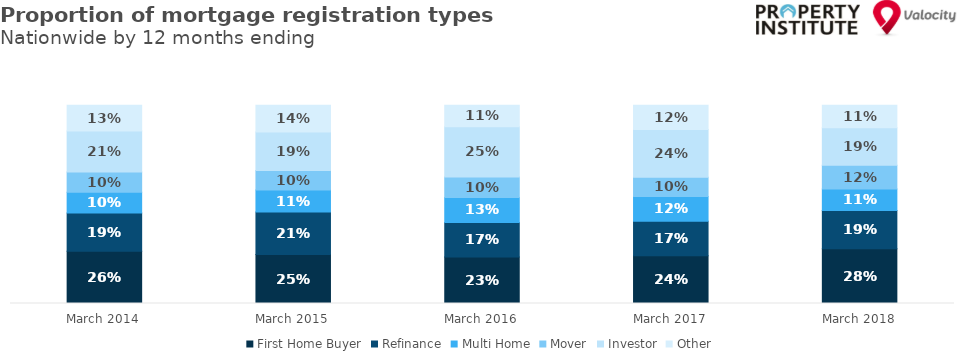
| Category | First Home Buyer | Refinance | Multi Home | Mover | Investor | Other |
|---|---|---|---|---|---|---|
| 2014-03-01 | 0.263 | 0.194 | 0.105 | 0.101 | 0.207 | 0.131 |
| 2015-03-01 | 0.247 | 0.214 | 0.111 | 0.099 | 0.194 | 0.136 |
| 2016-03-01 | 0.234 | 0.175 | 0.126 | 0.103 | 0.254 | 0.109 |
| 2017-03-01 | 0.24 | 0.175 | 0.124 | 0.098 | 0.24 | 0.123 |
| 2018-03-01 | 0.276 | 0.193 | 0.108 | 0.12 | 0.19 | 0.114 |